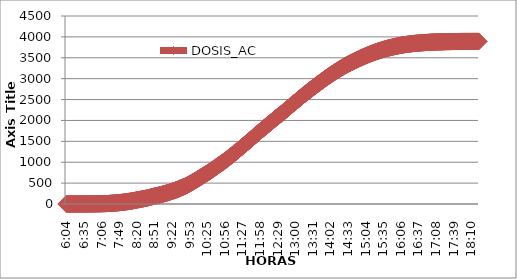
| Category | DOSIS_AC |
|---|---|
| 0.25277777777777777 | 0.014 |
| 0.2534722222222222 | 0.028 |
| 0.25416666666666665 | 0.042 |
| 0.2548611111111111 | 0.056 |
| 0.2555555555555556 | 0.07 |
| 0.25625000000000003 | 0.084 |
| 0.2569444444444445 | 0.098 |
| 0.2576388888888889 | 0.112 |
| 0.25833333333333336 | 0.126 |
| 0.2590277777777778 | 0.14 |
| 0.25972222222222224 | 0.154 |
| 0.2604166666666667 | 0.168 |
| 0.2611111111111111 | 0.196 |
| 0.26180555555555557 | 0.224 |
| 0.2625 | 0.252 |
| 0.26319444444444445 | 0.28 |
| 0.2638888888888889 | 0.308 |
| 0.26458333333333334 | 0.336 |
| 0.2652777777777778 | 0.363 |
| 0.2659722222222222 | 0.391 |
| 0.26666666666666666 | 0.433 |
| 0.2673611111111111 | 0.475 |
| 0.26805555555555555 | 0.517 |
| 0.26875 | 0.559 |
| 0.26944444444444443 | 0.601 |
| 0.2701388888888889 | 0.657 |
| 0.2708333333333333 | 0.713 |
| 0.27152777777777776 | 0.769 |
| 0.2722222222222222 | 0.825 |
| 0.27291666666666664 | 0.895 |
| 0.2736111111111111 | 0.965 |
| 0.2743055555555555 | 1.035 |
| 0.27499999999999997 | 1.118 |
| 0.27569444444444446 | 1.202 |
| 0.27638888888888885 | 1.286 |
| 0.27708333333333335 | 1.37 |
| 0.2777777777777778 | 1.468 |
| 0.27847222222222223 | 1.566 |
| 0.2791666666666667 | 1.678 |
| 0.2798611111111111 | 1.789 |
| 0.28055555555555556 | 1.901 |
| 0.28125 | 2.027 |
| 0.28194444444444444 | 2.153 |
| 0.2826388888888889 | 2.293 |
| 0.2833333333333333 | 2.433 |
| 0.28402777777777777 | 2.586 |
| 0.2847222222222222 | 2.74 |
| 0.28541666666666665 | 2.908 |
| 0.28611111111111115 | 3.076 |
| 0.28680555555555554 | 3.257 |
| 0.28750000000000003 | 3.439 |
| 0.2881944444444445 | 3.635 |
| 0.2888888888888889 | 3.844 |
| 0.28958333333333336 | 4.068 |
| 0.2902777777777778 | 4.292 |
| 0.29097222222222224 | 4.53 |
| 0.2916666666666667 | 4.781 |
| 0.2923611111111111 | 5.047 |
| 0.29305555555555557 | 5.312 |
| 0.29375 | 5.592 |
| 0.29444444444444445 | 5.886 |
| 0.2951388888888889 | 6.193 |
| 0.29583333333333334 | 6.515 |
| 0.2965277777777778 | 6.85 |
| 0.2972222222222222 | 7.2 |
| 0.29791666666666666 | 7.563 |
| 0.2986111111111111 | 7.941 |
| 0.29930555555555555 | 8.332 |
| 0.3 | 8.737 |
| 0.30277777777777776 | 9.199 |
| 0.3055555555555555 | 9.744 |
| 0.30833333333333335 | 10.373 |
| 0.30972222222222223 | 11.044 |
| 0.3111111111111111 | 11.771 |
| 0.3125 | 12.554 |
| 0.31319444444444444 | 13.365 |
| 0.3138888888888889 | 14.204 |
| 0.3145833333333333 | 15.056 |
| 0.31527777777777777 | 15.937 |
| 0.3159722222222222 | 16.846 |
| 0.31666666666666665 | 17.783 |
| 0.31736111111111115 | 18.733 |
| 0.31805555555555554 | 19.712 |
| 0.31875000000000003 | 20.732 |
| 0.3194444444444445 | 21.767 |
| 0.3201388888888889 | 22.815 |
| 0.32083333333333336 | 23.878 |
| 0.3215277777777778 | 24.968 |
| 0.32222222222222224 | 26.087 |
| 0.3229166666666667 | 27.247 |
| 0.3236111111111111 | 28.449 |
| 0.32430555555555557 | 29.708 |
| 0.325 | 31.008 |
| 0.32569444444444445 | 32.364 |
| 0.3263888888888889 | 33.762 |
| 0.32708333333333334 | 35.202 |
| 0.3277777777777778 | 36.67 |
| 0.3284722222222222 | 38.165 |
| 0.32916666666666666 | 39.689 |
| 0.3298611111111111 | 41.255 |
| 0.33055555555555555 | 42.835 |
| 0.33125 | 44.442 |
| 0.33194444444444443 | 46.106 |
| 0.3326388888888889 | 47.84 |
| 0.3333333333333333 | 49.643 |
| 0.3340277777777778 | 51.502 |
| 0.3347222222222222 | 53.404 |
| 0.3354166666666667 | 55.361 |
| 0.3361111111111111 | 57.374 |
| 0.3368055555555556 | 59.443 |
| 0.33749999999999997 | 61.554 |
| 0.33819444444444446 | 63.707 |
| 0.33888888888888885 | 65.916 |
| 0.33958333333333335 | 68.18 |
| 0.34027777777777773 | 70.501 |
| 0.34097222222222223 | 72.878 |
| 0.3416666666666666 | 75.324 |
| 0.3423611111111111 | 77.785 |
| 0.3430555555555555 | 80.273 |
| 0.34375 | 82.804 |
| 0.3444444444444445 | 85.292 |
| 0.3451388888888889 | 87.808 |
| 0.3458333333333334 | 90.367 |
| 0.34652777777777777 | 92.939 |
| 0.34722222222222227 | 95.511 |
| 0.34791666666666665 | 98.098 |
| 0.34861111111111115 | 100.656 |
| 0.34930555555555554 | 103.186 |
| 0.35000000000000003 | 105.689 |
| 0.3506944444444444 | 108.177 |
| 0.3513888888888889 | 110.666 |
| 0.3520833333333333 | 113.168 |
| 0.3527777777777778 | 115.698 |
| 0.3534722222222222 | 118.243 |
| 0.3541666666666667 | 120.843 |
| 0.3548611111111111 | 123.457 |
| 0.35555555555555557 | 126.086 |
| 0.35625 | 128.756 |
| 0.35694444444444445 | 131.398 |
| 0.3576388888888889 | 134.082 |
| 0.35833333333333334 | 136.878 |
| 0.3590277777777778 | 139.954 |
| 0.3597222222222222 | 143.155 |
| 0.36041666666666666 | 146.427 |
| 0.3611111111111111 | 149.726 |
| 0.36180555555555555 | 152.899 |
| 0.3625 | 156.199 |
| 0.36319444444444443 | 159.596 |
| 0.3638888888888889 | 163.105 |
| 0.3645833333333333 | 166.53 |
| 0.3652777777777778 | 169.843 |
| 0.3659722222222222 | 173.422 |
| 0.3666666666666667 | 177.155 |
| 0.3673611111111111 | 180.859 |
| 0.3680555555555556 | 184.466 |
| 0.36874999999999997 | 187.626 |
| 0.36944444444444446 | 190.645 |
| 0.37013888888888885 | 193.651 |
| 0.37083333333333335 | 197.132 |
| 0.37152777777777773 | 200.417 |
| 0.37222222222222223 | 203.507 |
| 0.3729166666666666 | 206.555 |
| 0.3736111111111111 | 209.672 |
| 0.3743055555555555 | 212.971 |
| 0.375 | 216.229 |
| 0.3756944444444445 | 219.458 |
| 0.3763888888888889 | 222.673 |
| 0.3770833333333334 | 225.917 |
| 0.37777777777777777 | 229.216 |
| 0.37847222222222227 | 232.767 |
| 0.37916666666666665 | 237.366 |
| 0.37986111111111115 | 241.854 |
| 0.38055555555555554 | 245.95 |
| 0.38125000000000003 | 249.585 |
| 0.3819444444444444 | 253.108 |
| 0.3826388888888889 | 257.106 |
| 0.3833333333333333 | 261.007 |
| 0.3840277777777778 | 264.53 |
| 0.3847222222222222 | 268.178 |
| 0.3854166666666667 | 272.065 |
| 0.3861111111111111 | 275.783 |
| 0.38680555555555557 | 279.6 |
| 0.3875 | 284.437 |
| 0.38819444444444445 | 289.386 |
| 0.3888888888888889 | 294.475 |
| 0.38958333333333334 | 299.018 |
| 0.3902777777777778 | 303.702 |
| 0.3909722222222222 | 308.483 |
| 0.39166666666666666 | 312.495 |
| 0.3923611111111111 | 316.801 |
| 0.39305555555555555 | 320.925 |
| 0.39375 | 325.315 |
| 0.39444444444444443 | 329.746 |
| 0.3951388888888889 | 335.212 |
| 0.3958333333333333 | 339.686 |
| 0.3965277777777778 | 345.348 |
| 0.3972222222222222 | 351.317 |
| 0.3979166666666667 | 357.399 |
| 0.3986111111111111 | 363.256 |
| 0.3993055555555556 | 369.366 |
| 0.39999999999999997 | 375.055 |
| 0.40069444444444446 | 380.941 |
| 0.40138888888888885 | 385.722 |
| 0.40208333333333335 | 391.049 |
| 0.40277777777777773 | 397.395 |
| 0.40347222222222223 | 403.379 |
| 0.4041666666666666 | 408.663 |
| 0.4048611111111111 | 414.213 |
| 0.4055555555555555 | 419.051 |
| 0.40625 | 424.209 |
| 0.4069444444444445 | 431.031 |
| 0.4076388888888889 | 438.091 |
| 0.4083333333333334 | 444.955 |
| 0.40902777777777777 | 452.085 |
| 0.40972222222222227 | 459.425 |
| 0.41041666666666665 | 466.904 |
| 0.41111111111111115 | 474.411 |
| 0.41180555555555554 | 482.044 |
| 0.41250000000000003 | 489.747 |
| 0.4131944444444444 | 497.492 |
| 0.4138888888888889 | 505.251 |
| 0.4145833333333333 | 513.08 |
| 0.4152777777777778 | 520.979 |
| 0.4159722222222222 | 528.905 |
| 0.4173611111111111 | 536.888 |
| 0.41805555555555557 | 544.898 |
| 0.41875 | 552.951 |
| 0.41944444444444445 | 561.073 |
| 0.4201388888888889 | 569.168 |
| 0.42083333333333334 | 577.346 |
| 0.4215277777777778 | 585.594 |
| 0.4222222222222222 | 593.87 |
| 0.42291666666666666 | 602.202 |
| 0.4236111111111111 | 610.577 |
| 0.42430555555555555 | 619.006 |
| 0.425 | 627.492 |
| 0.42569444444444443 | 636.02 |
| 0.4263888888888889 | 644.604 |
| 0.4270833333333333 | 653.216 |
| 0.4277777777777778 | 661.743 |
| 0.4284722222222222 | 670.397 |
| 0.4291666666666667 | 679.162 |
| 0.4298611111111111 | 687.956 |
| 0.4305555555555556 | 696.819 |
| 0.43124999999999997 | 705.445 |
| 0.43194444444444446 | 713.12 |
| 0.43263888888888885 | 721.2 |
| 0.43333333333333335 | 729.798 |
| 0.43402777777777773 | 737.878 |
| 0.43472222222222223 | 746.895 |
| 0.4354166666666666 | 755.969 |
| 0.4361111111111111 | 765.111 |
| 0.4368055555555555 | 774.31 |
| 0.4375 | 783.523 |
| 0.4381944444444445 | 792.946 |
| 0.4388888888888889 | 802.41 |
| 0.4395833333333334 | 811.847 |
| 0.44027777777777777 | 821.171 |
| 0.44097222222222227 | 830.608 |
| 0.44166666666666665 | 840.044 |
| 0.44236111111111115 | 849.257 |
| 0.44305555555555554 | 858.749 |
| 0.44375000000000003 | 868.228 |
| 0.4444444444444444 | 877.846 |
| 0.4451388888888889 | 887.534 |
| 0.4458333333333333 | 897.292 |
| 0.4465277777777778 | 907.05 |
| 0.4472222222222222 | 916.836 |
| 0.4479166666666667 | 926.622 |
| 0.4486111111111111 | 936.408 |
| 0.44930555555555557 | 945.957 |
| 0.45 | 955.225 |
| 0.45069444444444445 | 964.284 |
| 0.4513888888888889 | 973.33 |
| 0.45208333333333334 | 982.403 |
| 0.4527777777777778 | 991.783 |
| 0.4534722222222222 | 1001.373 |
| 0.45416666666666666 | 1011.425 |
| 0.4548611111111111 | 1021.798 |
| 0.45555555555555555 | 1032.185 |
| 0.45625 | 1042.447 |
| 0.45694444444444443 | 1052.806 |
| 0.4576388888888889 | 1063.473 |
| 0.4583333333333333 | 1074.195 |
| 0.4590277777777778 | 1084.946 |
| 0.4597222222222222 | 1095.78 |
| 0.4604166666666667 | 1106.643 |
| 0.4611111111111111 | 1117.421 |
| 0.4618055555555556 | 1128.102 |
| 0.46249999999999997 | 1138.657 |
| 0.46319444444444446 | 1149.058 |
| 0.46388888888888885 | 1159.837 |
| 0.46458333333333335 | 1170.755 |
| 0.46527777777777773 | 1181.687 |
| 0.46597222222222223 | 1192.802 |
| 0.4666666666666666 | 1203.93 |
| 0.4673611111111111 | 1214.918 |
| 0.4680555555555555 | 1225.906 |
| 0.46875 | 1236.936 |
| 0.4694444444444445 | 1248.023 |
| 0.4701388888888889 | 1259.221 |
| 0.4708333333333334 | 1270.516 |
| 0.47152777777777777 | 1281.882 |
| 0.47222222222222227 | 1293.276 |
| 0.47291666666666665 | 1304.711 |
| 0.47361111111111115 | 1316.231 |
| 0.47430555555555554 | 1327.778 |
| 0.47500000000000003 | 1339.326 |
| 0.4756944444444444 | 1350.873 |
| 0.4763888888888889 | 1362.407 |
| 0.4770833333333333 | 1373.898 |
| 0.4777777777777778 | 1385.488 |
| 0.4784722222222222 | 1397.245 |
| 0.4791666666666667 | 1408.96 |
| 0.4798611111111111 | 1420.717 |
| 0.48055555555555557 | 1432.503 |
| 0.48125 | 1444.302 |
| 0.48194444444444445 | 1456.059 |
| 0.4826388888888889 | 1467.564 |
| 0.48333333333333334 | 1478.734 |
| 0.4840277777777778 | 1489.863 |
| 0.4847222222222222 | 1501.298 |
| 0.48541666666666666 | 1512.916 |
| 0.4861111111111111 | 1524.533 |
| 0.48680555555555555 | 1536.29 |
| 0.4875 | 1547.991 |
| 0.48819444444444443 | 1559.86 |
| 0.4888888888888889 | 1571.743 |
| 0.4895833333333333 | 1583.794 |
| 0.4902777777777778 | 1595.943 |
| 0.4909722222222222 | 1608.091 |
| 0.4916666666666667 | 1620.156 |
| 0.4923611111111111 | 1632.053 |
| 0.4930555555555556 | 1643.768 |
| 0.49374999999999997 | 1655.498 |
| 0.49444444444444446 | 1667.241 |
| 0.49513888888888885 | 1679.04 |
| 0.49583333333333335 | 1690.811 |
| 0.49652777777777773 | 1702.456 |
| 0.49722222222222223 | 1714.27 |
| 0.4979166666666666 | 1726.139 |
| 0.4986111111111111 | 1737.938 |
| 0.4993055555555555 | 1749.667 |
| 0.5 | 1761.382 |
| 0.5006944444444444 | 1772.874 |
| 0.5013888888888889 | 1784.1 |
| 0.5020833333333333 | 1795.368 |
| 0.5027777777777778 | 1806.817 |
| 0.5034722222222222 | 1818.043 |
| 0.5041666666666667 | 1829.213 |
| 0.5048611111111111 | 1840.537 |
| 0.5055555555555555 | 1851.777 |
| 0.50625 | 1863.073 |
| 0.5069444444444444 | 1874.327 |
| 0.5076388888888889 | 1885.455 |
| 0.5083333333333333 | 1896.709 |
| 0.5090277777777777 | 1908.172 |
| 0.5097222222222222 | 1919.594 |
| 0.5104166666666666 | 1930.834 |
| 0.5111111111111112 | 1942.088 |
| 0.5118055555555555 | 1953.202 |
| 0.5125000000000001 | 1964.526 |
| 0.5131944444444444 | 1975.877 |
| 0.513888888888889 | 1987.131 |
| 0.5145833333333333 | 1998.413 |
| 0.5152777777777778 | 2009.779 |
| 0.5159722222222222 | 2021.382 |
| 0.5166666666666667 | 2033.041 |
| 0.517361111111111 | 2044.743 |
| 0.5180555555555556 | 2056.36 |
| 0.5187499999999999 | 2067.768 |
| 0.5194444444444445 | 2078.994 |
| 0.5201388888888888 | 2090.052 |
| 0.5208333333333334 | 2100.789 |
| 0.5215277777777778 | 2111.553 |
| 0.5222222222222223 | 2122.304 |
| 0.5229166666666667 | 2132.859 |
| 0.5236111111111111 | 2143.414 |
| 0.5243055555555556 | 2153.801 |
| 0.525 | 2164.384 |
| 0.5256944444444445 | 2175.204 |
| 0.5263888888888889 | 2186.206 |
| 0.5270833333333333 | 2197.502 |
| 0.5277777777777778 | 2209.064 |
| 0.5284722222222222 | 2220.555 |
| 0.5291666666666667 | 2231.907 |
| 0.5298611111111111 | 2243.315 |
| 0.5305555555555556 | 2254.946 |
| 0.53125 | 2266.675 |
| 0.5319444444444444 | 2278.432 |
| 0.5326388888888889 | 2290.134 |
| 0.5333333333333333 | 2301.919 |
| 0.5340277777777778 | 2313.69 |
| 0.5347222222222222 | 2325.545 |
| 0.5354166666666667 | 2337.33 |
| 0.5361111111111111 | 2349.031 |
| 0.5368055555555555 | 2360.733 |
| 0.5375 | 2372.308 |
| 0.5381944444444444 | 2383.814 |
| 0.5388888888888889 | 2395.082 |
| 0.5395833333333333 | 2406.294 |
| 0.5402777777777777 | 2417.478 |
| 0.5409722222222222 | 2428.634 |
| 0.5416666666666666 | 2439.776 |
| 0.5423611111111112 | 2451.002 |
| 0.5430555555555555 | 2462.2 |
| 0.5437500000000001 | 2473.551 |
| 0.5444444444444444 | 2485.057 |
| 0.545138888888889 | 2496.576 |
| 0.5458333333333333 | 2508.138 |
| 0.5465277777777778 | 2519.685 |
| 0.5472222222222222 | 2531.219 |
| 0.5479166666666667 | 2542.654 |
| 0.548611111111111 | 2553.964 |
| 0.5493055555555556 | 2565.232 |
| 0.5499999999999999 | 2576.528 |
| 0.5506944444444445 | 2587.81 |
| 0.5513888888888888 | 2599.022 |
| 0.5520833333333334 | 2610.136 |
| 0.5527777777777778 | 2621.222 |
| 0.5534722222222223 | 2632.266 |
| 0.5541666666666667 | 2643.101 |
| 0.5548611111111111 | 2653.851 |
| 0.5555555555555556 | 2664.546 |
| 0.55625 | 2675.115 |
| 0.5569444444444445 | 2685.684 |
| 0.5576388888888889 | 2696.183 |
| 0.5583333333333333 | 2706.752 |
| 0.5590277777777778 | 2717.321 |
| 0.5597222222222222 | 2727.889 |
| 0.5604166666666667 | 2738.528 |
| 0.5611111111111111 | 2749.195 |
| 0.5618055555555556 | 2759.848 |
| 0.5625 | 2770.375 |
| 0.5631944444444444 | 2780.762 |
| 0.5638888888888889 | 2791.079 |
| 0.5645833333333333 | 2801.396 |
| 0.5652777777777778 | 2811.672 |
| 0.5659722222222222 | 2821.933 |
| 0.5666666666666667 | 2832.11 |
| 0.5673611111111111 | 2842.218 |
| 0.5680555555555555 | 2852.325 |
| 0.56875 | 2862.405 |
| 0.5694444444444444 | 2872.527 |
| 0.5701388888888889 | 2882.69 |
| 0.5708333333333333 | 2892.839 |
| 0.5715277777777777 | 2902.891 |
| 0.5722222222222222 | 2913.055 |
| 0.5729166666666666 | 2923.162 |
| 0.5736111111111112 | 2933.298 |
| 0.5743055555555555 | 2943.321 |
| 0.5750000000000001 | 2953.303 |
| 0.5756944444444444 | 2963.299 |
| 0.576388888888889 | 2973.183 |
| 0.5770833333333333 | 2982.982 |
| 0.5777777777777778 | 2992.782 |
| 0.5784722222222222 | 3002.596 |
| 0.5791666666666667 | 3012.382 |
| 0.579861111111111 | 3022.113 |
| 0.5805555555555556 | 3031.787 |
| 0.5812499999999999 | 3041.419 |
| 0.5819444444444445 | 3051.023 |
| 0.5826388888888888 | 3060.544 |
| 0.5833333333333334 | 3070.078 |
| 0.5840277777777778 | 3079.458 |
| 0.5847222222222223 | 3088.783 |
| 0.5854166666666667 | 3097.87 |
| 0.5861111111111111 | 3106.887 |
| 0.5868055555555556 | 3115.96 |
| 0.5875 | 3124.977 |
| 0.5881944444444445 | 3133.771 |
| 0.5888888888888889 | 3142.634 |
| 0.5895833333333333 | 3151.497 |
| 0.5902777777777778 | 3160.347 |
| 0.5909722222222222 | 3169.168 |
| 0.5916666666666667 | 3177.99 |
| 0.5923611111111111 | 3186.783 |
| 0.5930555555555556 | 3195.534 |
| 0.59375 | 3204.146 |
| 0.5944444444444444 | 3212.688 |
| 0.5951388888888889 | 3221.132 |
| 0.5958333333333333 | 3229.422 |
| 0.5965277777777778 | 3237.642 |
| 0.5972222222222222 | 3245.751 |
| 0.5979166666666667 | 3253.817 |
| 0.5986111111111111 | 3261.897 |
| 0.5993055555555555 | 3270.048 |
| 0.6 | 3278.17 |
| 0.6006944444444444 | 3286.209 |
| 0.6013888888888889 | 3294.205 |
| 0.6020833333333333 | 3302.09 |
| 0.6027777777777777 | 3309.863 |
| 0.6034722222222222 | 3317.44 |
| 0.6041666666666666 | 3324.807 |
| 0.6048611111111112 | 3332.147 |
| 0.6055555555555555 | 3339.431 |
| 0.6062500000000001 | 3346.574 |
| 0.6069444444444444 | 3353.704 |
| 0.607638888888889 | 3360.764 |
| 0.6083333333333333 | 3367.698 |
| 0.6090277777777778 | 3374.688 |
| 0.6097222222222222 | 3381.399 |
| 0.6104166666666667 | 3388.011 |
| 0.611111111111111 | 3394.624 |
| 0.6118055555555556 | 3401.32 |
| 0.6124999999999999 | 3408.17 |
| 0.6131944444444445 | 3414.964 |
| 0.6138888888888888 | 3421.661 |
| 0.6145833333333334 | 3428.287 |
| 0.6152777777777778 | 3434.844 |
| 0.6159722222222223 | 3441.457 |
| 0.6166666666666667 | 3448.111 |
| 0.6173611111111111 | 3454.71 |
| 0.6180555555555556 | 3461.28 |
| 0.61875 | 3467.809 |
| 0.6194444444444445 | 3474.24 |
| 0.6201388888888889 | 3480.629 |
| 0.6208333333333333 | 3486.934 |
| 0.6215277777777778 | 3493.113 |
| 0.6222222222222222 | 3499.306 |
| 0.6229166666666667 | 3505.499 |
| 0.6236111111111111 | 3511.664 |
| 0.6243055555555556 | 3517.69 |
| 0.625 | 3523.659 |
| 0.6256944444444444 | 3529.628 |
| 0.6263888888888889 | 3535.57 |
| 0.6270833333333333 | 3541.442 |
| 0.6277777777777778 | 3547.229 |
| 0.6284722222222222 | 3552.975 |
| 0.6291666666666667 | 3558.707 |
| 0.6298611111111111 | 3564.369 |
| 0.6305555555555555 | 3569.919 |
| 0.63125 | 3575.385 |
| 0.6319444444444444 | 3580.781 |
| 0.6326388888888889 | 3586.136 |
| 0.6333333333333333 | 3591.462 |
| 0.6340277777777777 | 3596.774 |
| 0.6347222222222222 | 3602.031 |
| 0.6354166666666666 | 3607.203 |
| 0.6361111111111112 | 3612.32 |
| 0.6368055555555555 | 3617.395 |
| 0.6375000000000001 | 3622.47 |
| 0.6381944444444444 | 3627.46 |
| 0.638888888888889 | 3632.214 |
| 0.6395833333333333 | 3636.869 |
| 0.6402777777777778 | 3641.552 |
| 0.6409722222222222 | 3646.278 |
| 0.6416666666666667 | 3650.919 |
| 0.642361111111111 | 3655.532 |
| 0.6430555555555556 | 3660.104 |
| 0.6437499999999999 | 3664.591 |
| 0.6444444444444445 | 3669.093 |
| 0.6451388888888888 | 3673.581 |
| 0.6458333333333334 | 3678.026 |
| 0.6465277777777778 | 3682.388 |
| 0.6472222222222223 | 3686.666 |
| 0.6479166666666667 | 3690.874 |
| 0.6486111111111111 | 3695.012 |
| 0.6493055555555556 | 3699.024 |
| 0.65 | 3702.939 |
| 0.6506944444444445 | 3706.839 |
| 0.6513888888888889 | 3710.655 |
| 0.6520833333333333 | 3714.332 |
| 0.6527777777777778 | 3717.967 |
| 0.6534722222222222 | 3721.588 |
| 0.6541666666666667 | 3725.153 |
| 0.6548611111111111 | 3728.662 |
| 0.6555555555555556 | 3732.129 |
| 0.65625 | 3735.554 |
| 0.6569444444444444 | 3739.021 |
| 0.6576388888888889 | 3742.474 |
| 0.6583333333333333 | 3745.871 |
| 0.6590277777777778 | 3749.24 |
| 0.6597222222222222 | 3752.568 |
| 0.6604166666666667 | 3755.825 |
| 0.6611111111111111 | 3759.026 |
| 0.6618055555555555 | 3762.186 |
| 0.6625 | 3765.303 |
| 0.6631944444444444 | 3768.379 |
| 0.6638888888888889 | 3771.413 |
| 0.6645833333333333 | 3774.376 |
| 0.6652777777777777 | 3777.284 |
| 0.6659722222222222 | 3780.15 |
| 0.6666666666666666 | 3782.988 |
| 0.6673611111111111 | 3785.77 |
| 0.6680555555555556 | 3788.468 |
| 0.6687500000000001 | 3791.096 |
| 0.6694444444444444 | 3793.683 |
| 0.6701388888888888 | 3796.227 |
| 0.6708333333333334 | 3798.729 |
| 0.6715277777777778 | 3801.162 |
| 0.6722222222222222 | 3803.567 |
| 0.6729166666666666 | 3805.915 |
| 0.6736111111111112 | 3808.194 |
| 0.6743055555555556 | 3810.417 |
| 0.6749999999999999 | 3812.584 |
| 0.6756944444444444 | 3814.695 |
| 0.6763888888888889 | 3816.722 |
| 0.6770833333333334 | 3818.679 |
| 0.6777777777777777 | 3820.608 |
| 0.6784722222222223 | 3822.495 |
| 0.6791666666666667 | 3824.355 |
| 0.6798611111111111 | 3826.158 |
| 0.6805555555555555 | 3827.92 |
| 0.68125 | 3829.639 |
| 0.6819444444444445 | 3831.289 |
| 0.6826388888888889 | 3832.911 |
| 0.6833333333333332 | 3834.518 |
| 0.6840277777777778 | 3836.098 |
| 0.6847222222222222 | 3837.636 |
| 0.6854166666666667 | 3839.118 |
| 0.686111111111111 | 3840.572 |
| 0.6868055555555556 | 3841.998 |
| 0.6875 | 3843.396 |
| 0.6881944444444444 | 3844.766 |
| 0.688888888888889 | 3846.094 |
| 0.6895833333333333 | 3847.394 |
| 0.6902777777777778 | 3848.666 |
| 0.6909722222222222 | 3849.91 |
| 0.6916666666666668 | 3851.127 |
| 0.6923611111111111 | 3852.315 |
| 0.6930555555555555 | 3853.475 |
| 0.69375 | 3854.608 |
| 0.6944444444444445 | 3855.712 |
| 0.6951388888888889 | 3856.788 |
| 0.6958333333333333 | 3857.837 |
| 0.6965277777777777 | 3858.857 |
| 0.6972222222222223 | 3859.864 |
| 0.6979166666666666 | 3860.843 |
| 0.6986111111111111 | 3861.793 |
| 0.6993055555555556 | 3862.73 |
| 0.7000000000000001 | 3863.653 |
| 0.7006944444444444 | 3864.547 |
| 0.7013888888888888 | 3865.428 |
| 0.7020833333333334 | 3866.295 |
| 0.7027777777777778 | 3867.148 |
| 0.7034722222222222 | 3867.972 |
| 0.7041666666666666 | 3868.783 |
| 0.7048611111111112 | 3869.58 |
| 0.7055555555555556 | 3870.349 |
| 0.7062499999999999 | 3871.104 |
| 0.7069444444444444 | 3871.845 |
| 0.7076388888888889 | 3872.558 |
| 0.7083333333333334 | 3873.257 |
| 0.7090277777777777 | 3873.942 |
| 0.7097222222222223 | 3874.599 |
| 0.7104166666666667 | 3875.242 |
| 0.7111111111111111 | 3875.871 |
| 0.7118055555555555 | 3876.486 |
| 0.7125 | 3877.087 |
| 0.7131944444444445 | 3877.675 |
| 0.7138888888888889 | 3878.248 |
| 0.7145833333333332 | 3878.807 |
| 0.7152777777777778 | 3879.338 |
| 0.7159722222222222 | 3879.855 |
| 0.7166666666666667 | 3880.359 |
| 0.717361111111111 | 3880.848 |
| 0.7180555555555556 | 3881.323 |
| 0.71875 | 3881.785 |
| 0.7194444444444444 | 3882.232 |
| 0.720138888888889 | 3882.651 |
| 0.7208333333333333 | 3883.057 |
| 0.7215277777777778 | 3883.448 |
| 0.7222222222222222 | 3883.826 |
| 0.7229166666666668 | 3884.189 |
| 0.7236111111111111 | 3884.539 |
| 0.7243055555555555 | 3884.874 |
| 0.725 | 3885.196 |
| 0.7256944444444445 | 3885.503 |
| 0.7263888888888889 | 3885.797 |
| 0.7270833333333333 | 3886.09 |
| 0.7277777777777777 | 3886.37 |
| 0.7284722222222223 | 3886.636 |
| 0.7291666666666666 | 3886.887 |
| 0.7298611111111111 | 3887.125 |
| 0.7305555555555556 | 3887.363 |
| 0.7312500000000001 | 3887.586 |
| 0.7319444444444444 | 3887.796 |
| 0.7326388888888888 | 3887.992 |
| 0.7333333333333334 | 3888.187 |
| 0.7340277777777778 | 3888.369 |
| 0.7347222222222222 | 3888.537 |
| 0.7354166666666666 | 3888.705 |
| 0.7361111111111112 | 3888.859 |
| 0.7368055555555556 | 3889.012 |
| 0.7374999999999999 | 3889.152 |
| 0.7381944444444444 | 3889.292 |
| 0.7388888888888889 | 3889.418 |
| 0.7395833333333334 | 3889.544 |
| 0.7402777777777777 | 3889.655 |
| 0.7409722222222223 | 3889.767 |
| 0.7416666666666667 | 3889.865 |
| 0.7423611111111111 | 3889.963 |
| 0.7430555555555555 | 3890.061 |
| 0.74375 | 3890.145 |
| 0.7444444444444445 | 3890.229 |
| 0.7451388888888889 | 3890.312 |
| 0.7458333333333332 | 3890.382 |
| 0.7465277777777778 | 3890.452 |
| 0.7472222222222222 | 3890.522 |
| 0.7479166666666667 | 3890.592 |
| 0.748611111111111 | 3890.648 |
| 0.7493055555555556 | 3890.704 |
| 0.75 | 3890.76 |
| 0.7506944444444444 | 3890.802 |
| 0.751388888888889 | 3890.844 |
| 0.7520833333333333 | 3890.886 |
| 0.7527777777777778 | 3890.928 |
| 0.7534722222222222 | 3890.97 |
| 0.7541666666666668 | 3890.997 |
| 0.7548611111111111 | 3891.025 |
| 0.7555555555555555 | 3891.053 |
| 0.75625 | 3891.081 |
| 0.7569444444444445 | 3891.109 |
| 0.7576388888888889 | 3891.137 |
| 0.7583333333333333 | 3891.165 |
| 0.7590277777777777 | 3891.179 |
| 0.7597222222222223 | 3891.193 |
| 0.7604166666666666 | 3891.207 |
| 0.7611111111111111 | 3891.221 |
| 0.7618055555555556 | 3891.235 |
| 0.7625000000000001 | 3891.249 |
| 0.7631944444444444 | 3891.263 |
| 0.7638888888888888 | 3891.277 |
| 0.7645833333333334 | 3891.291 |
| 0.7652777777777778 | 3891.305 |
| 0.7659722222222222 | 3891.319 |